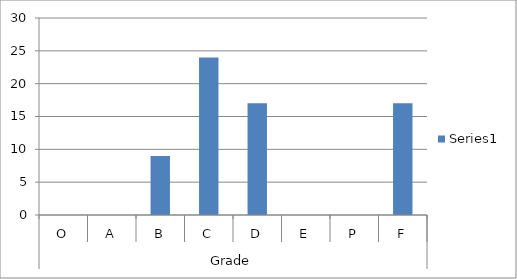
| Category | Series 0 |
|---|---|
| 0 | 0 |
| 1 | 0 |
| 2 | 9 |
| 3 | 24 |
| 4 | 17 |
| 5 | 0 |
| 6 | 0 |
| 7 | 17 |